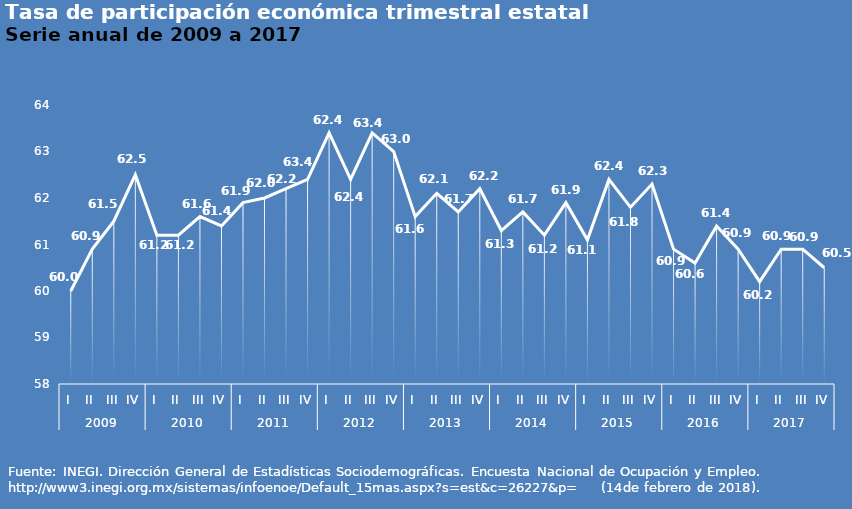
| Category | Series 0 |
|---|---|
| 0 | 60 |
| 1 | 60.9 |
| 2 | 61.5 |
| 3 | 62.5 |
| 4 | 61.2 |
| 5 | 61.2 |
| 6 | 61.6 |
| 7 | 61.4 |
| 8 | 61.9 |
| 9 | 62 |
| 10 | 62.2 |
| 11 | 62.4 |
| 12 | 63.4 |
| 13 | 62.4 |
| 14 | 63.4 |
| 15 | 63 |
| 16 | 61.6 |
| 17 | 62.1 |
| 18 | 61.7 |
| 19 | 62.2 |
| 20 | 61.3 |
| 21 | 61.7 |
| 22 | 61.2 |
| 23 | 61.9 |
| 24 | 61.1 |
| 25 | 62.4 |
| 26 | 61.8 |
| 27 | 62.3 |
| 28 | 60.9 |
| 29 | 60.6 |
| 30 | 61.4 |
| 31 | 60.9 |
| 32 | 60.2 |
| 33 | 60.9 |
| 34 | 60.9 |
| 35 | 60.5 |